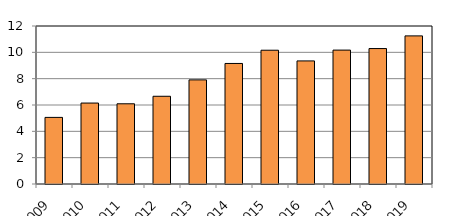
| Category | Series 1 |
|---|---|
| 2009 | 5058 |
| 2010 | 6148 |
| 2011 | 6092 |
| 2012 | 6663 |
| 2013 | 7908 |
| 2014 | 9155 |
| 2015 | 10160 |
| 2016 | 9348 |
| 2017 | 10170 |
| 2018 | 10287 |
| 2019 | 11249 |